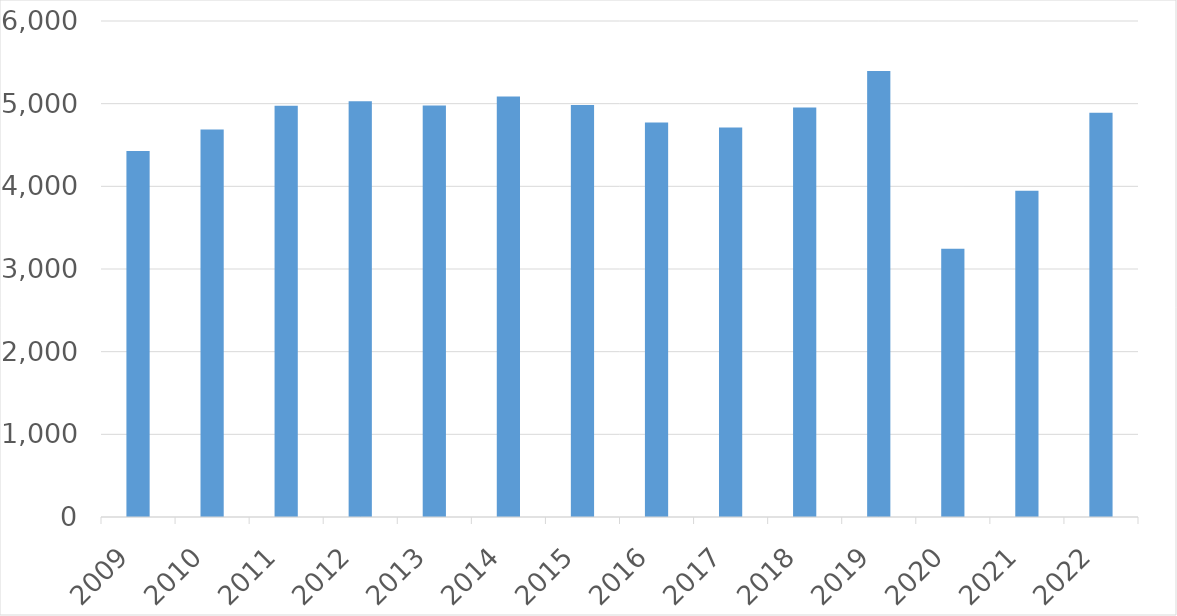
| Category | Series 0 |
|---|---|
| 2009 | 4428 |
| 2010 | 4686 |
| 2011 | 4974 |
| 2012 | 5029 |
| 2013 | 4979 |
| 2014 | 5086 |
| 2015 | 4983 |
| 2016 | 4771 |
| 2017 | 4712 |
| 2018 | 4954 |
| 2019 | 5394 |
| 2020 | 3244 |
| 2021 | 3948 |
| 2022 | 4889 |